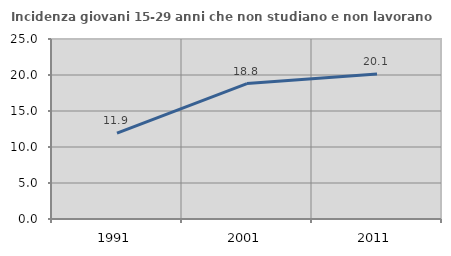
| Category | Incidenza giovani 15-29 anni che non studiano e non lavorano  |
|---|---|
| 1991.0 | 11.93 |
| 2001.0 | 18.816 |
| 2011.0 | 20.126 |